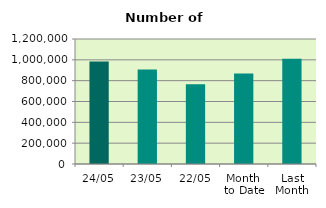
| Category | Series 0 |
|---|---|
| 24/05 | 983434 |
| 23/05 | 906538 |
| 22/05 | 766328 |
| Month 
to Date | 868865.882 |
| Last
Month | 1010681.333 |